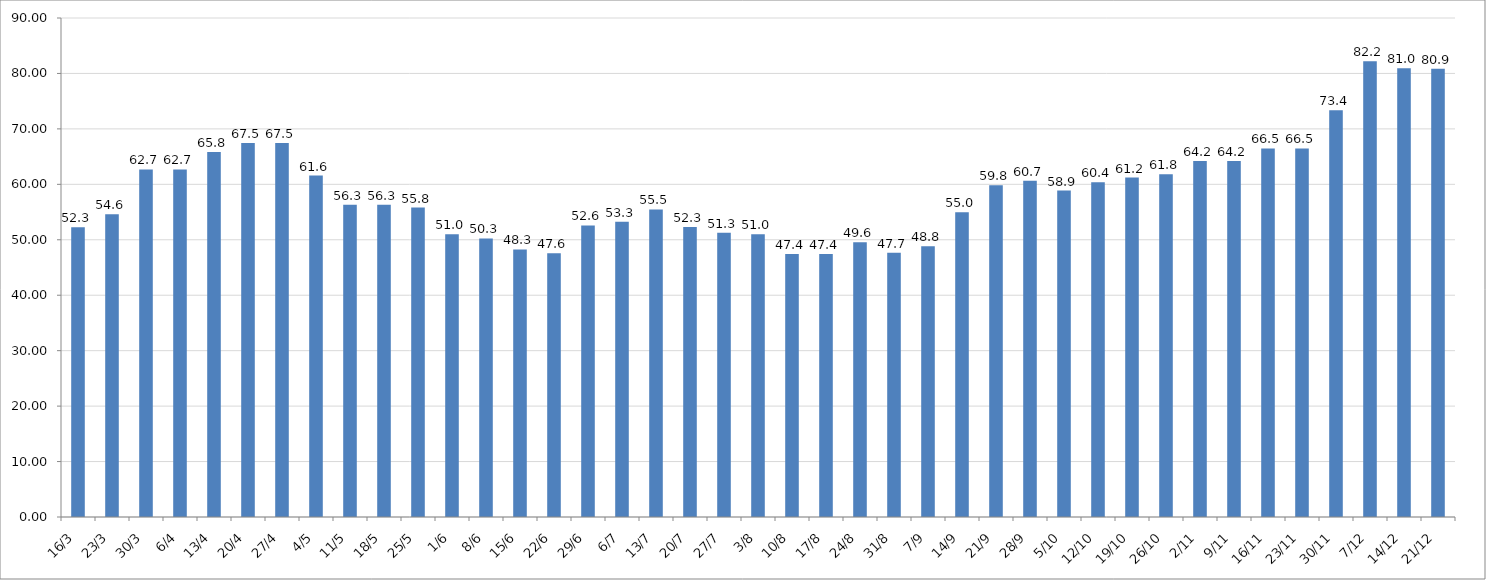
| Category | Series 0 |
|---|---|
| 2020-03-16 | 52.25 |
| 2020-03-23 | 54.583 |
| 2020-03-30 | 62.683 |
| 2020-04-06 | 62.683 |
| 2020-04-13 | 65.817 |
| 2020-04-20 | 67.467 |
| 2020-04-27 | 67.467 |
| 2020-05-04 | 61.583 |
| 2020-05-11 | 56.3 |
| 2020-05-18 | 56.3 |
| 2020-05-25 | 55.8 |
| 2020-06-01 | 50.992 |
| 2020-06-08 | 50.25 |
| 2020-06-15 | 48.25 |
| 2020-06-22 | 47.583 |
| 2020-06-29 | 52.583 |
| 2020-07-06 | 53.25 |
| 2020-07-13 | 55.483 |
| 2020-07-20 | 52.317 |
| 2020-07-27 | 51.25 |
| 2020-08-03 | 51.017 |
| 2020-08-10 | 47.417 |
| 2020-08-17 | 47.417 |
| 2020-08-24 | 49.55 |
| 2020-08-31 | 47.658 |
| 2020-09-07 | 48.825 |
| 2020-09-14 | 54.983 |
| 2020-09-21 | 59.817 |
| 2020-09-28 | 60.65 |
| 2020-10-05 | 58.883 |
| 2020-10-12 | 60.383 |
| 2020-10-19 | 61.217 |
| 2020-10-26 | 61.817 |
| 2020-11-02 | 64.2 |
| 2020-11-09 | 64.2 |
| 2020-11-16 | 66.475 |
| 2020-11-23 | 66.475 |
| 2020-11-30 | 73.367 |
| 2020-12-07 | 82.2 |
| 2020-12-14 | 80.958 |
| 2020-12-21 | 80.867 |